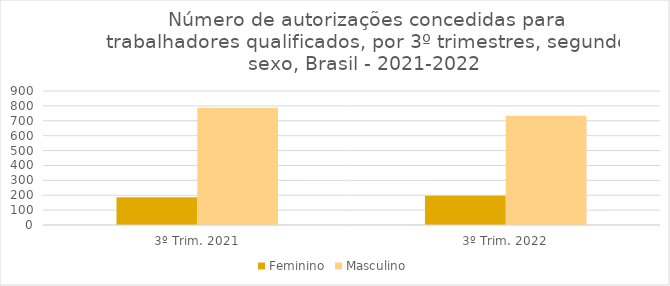
| Category | Feminino | Masculino |
|---|---|---|
| 3º Trim. 2021 | 187 | 787 |
| 3º Trim. 2022 | 196 | 734 |